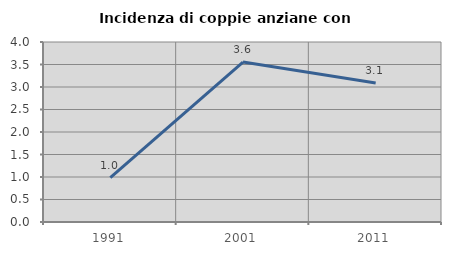
| Category | Incidenza di coppie anziane con figli |
|---|---|
| 1991.0 | 0.988 |
| 2001.0 | 3.554 |
| 2011.0 | 3.09 |